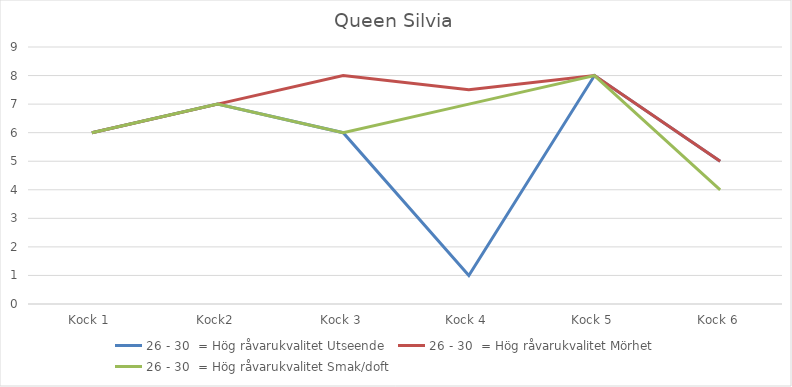
| Category | 26 - 30  = Hög råvarukvalitet Utseende | 26 - 30  = Hög råvarukvalitet Mörhet | 26 - 30  = Hög råvarukvalitet Smak/doft |
|---|---|---|---|
| Kock 1 | 6 | 6 | 6 |
| Kock2 | 7 | 7 | 7 |
| Kock 3 | 6 | 8 | 6 |
| Kock 4 | 1 | 7.5 | 7 |
| Kock 5 | 8 | 8 | 8 |
| Kock 6 | 5 | 5 | 4 |